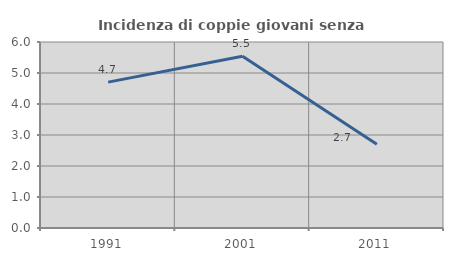
| Category | Incidenza di coppie giovani senza figli |
|---|---|
| 1991.0 | 4.706 |
| 2001.0 | 5.538 |
| 2011.0 | 2.703 |